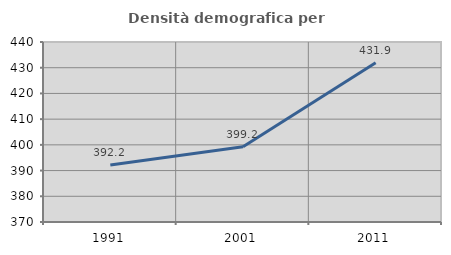
| Category | Densità demografica |
|---|---|
| 1991.0 | 392.158 |
| 2001.0 | 399.232 |
| 2011.0 | 431.919 |